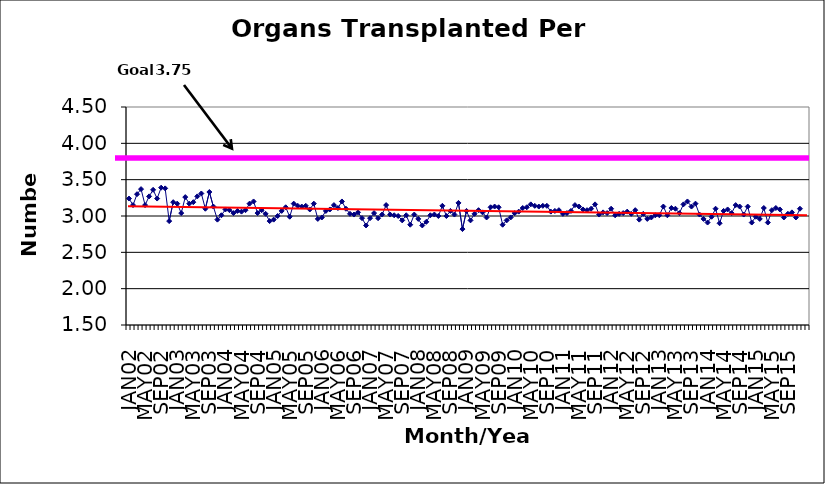
| Category | Series 0 |
|---|---|
| JAN02 | 3.24 |
| FEB02 | 3.15 |
| MAR02 | 3.3 |
| APR02 | 3.37 |
| MAY02 | 3.15 |
| JUN02 | 3.27 |
| JUL02 | 3.36 |
| AUG02 | 3.24 |
| SEP02 | 3.39 |
| OCT02 | 3.38 |
| NOV02 | 2.93 |
| DEC02 | 3.19 |
| JAN03 | 3.17 |
| FEB03 | 3.04 |
| MAR03 | 3.26 |
| APR03 | 3.17 |
| MAY03 | 3.19 |
| JUN03 | 3.27 |
| JUL03 | 3.31 |
| AUG03 | 3.1 |
| SEP03 | 3.33 |
| OCT03 | 3.13 |
| NOV03 | 2.95 |
| DEC03 | 3.01 |
| JAN04 | 3.09 |
| FEB04 | 3.08 |
| MAR04 | 3.04 |
| APR04 | 3.07 |
| MAY04 | 3.06 |
| JUN04 | 3.08 |
| JUL04 | 3.17 |
| AUG04 | 3.2 |
| SEP04 | 3.04 |
| OCT04 | 3.08 |
| NOV04 | 3.03 |
| DEC04 | 2.93 |
| JAN05 | 2.95 |
| FEB05 | 3 |
| MAR05 | 3.07 |
| APR05 | 3.12 |
| MAY05 | 2.99 |
| JUN05 | 3.17 |
| JUL05 | 3.14 |
| AUG05 | 3.13 |
| SEP05 | 3.14 |
| OCT05 | 3.09 |
| NOV05 | 3.17 |
| DEC05 | 2.96 |
| JAN06 | 2.98 |
| FEB06 | 3.07 |
| MAR06 | 3.09 |
| APR06 | 3.15 |
| MAY06 | 3.11 |
| JUN06 | 3.2 |
| JUL06 | 3.1 |
| AUG06 | 3.03 |
| SEP06 | 3.02 |
| OCT06 | 3.05 |
| NOV06 | 2.97 |
| DEC06 | 2.87 |
| JAN07 | 2.97 |
| FEB07 | 3.04 |
| MAR07 | 2.97 |
| APR07 | 3.02 |
| MAY07 | 3.15 |
| JUN07 | 3.02 |
| JUL07 | 3.01 |
| AUG07 | 3 |
| SEP07 | 2.94 |
| OCT07 | 3.01 |
| NOV07 | 2.88 |
| DEC07 | 3.02 |
| JAN08 | 2.96 |
| FEB08 | 2.87 |
| MAR08 | 2.92 |
| APR08 | 3.01 |
| MAY08 | 3.02 |
| JUN08 | 3 |
| JUL08 | 3.14 |
| AUG08 | 3 |
| SEP08 | 3.07 |
| OCT08 | 3.02 |
| NOV08 | 3.18 |
| DEC08 | 2.82 |
| JAN09 | 3.07 |
| FEB09 | 2.94 |
| MAR09 | 3.03 |
| APR09 | 3.08 |
| MAY09 | 3.05 |
| JUN09 | 2.98 |
| JUL09 | 3.12 |
| AUG09 | 3.13 |
| SEP09 | 3.12 |
| OCT09 | 2.88 |
| NOV09 | 2.94 |
| DEC09 | 2.98 |
| JAN10 | 3.04 |
| FEB10 | 3.06 |
| MAR10 | 3.11 |
| APR10 | 3.12 |
| MAY10 | 3.16 |
| JUN10 | 3.14 |
| JUL10 | 3.13 |
| AUG10 | 3.14 |
| SEP10 | 3.14 |
| OCT10 | 3.06 |
| NOV10 | 3.07 |
| DEC10 | 3.08 |
| JAN11 | 3.03 |
| FEB11 | 3.04 |
| MAR11 | 3.07 |
| APR11 | 3.15 |
| MAY11 | 3.13 |
| JUN11 | 3.09 |
| JUL11 | 3.08 |
| AUG11 | 3.1 |
| SEP11 | 3.16 |
| OCT11 | 3.02 |
| NOV11 | 3.05 |
| DEC11 | 3.04 |
| JAN12 | 3.1 |
| FEB12 | 3.01 |
| MAR12 | 3.03 |
| APR12 | 3.04 |
| MAY12 | 3.06 |
| JUN12 | 3.03 |
| JUL12 | 3.08 |
| AUG12 | 2.95 |
| SEP12 | 3.03 |
| OCT12 | 2.96 |
| NOV12 | 2.98 |
| DEC12 | 3.01 |
| JAN13 | 3.01 |
| FEB13 | 3.13 |
| MAR13 | 3.01 |
| APR13 | 3.11 |
| MAY13 | 3.1 |
| JUN13 | 3.04 |
| JUL13 | 3.16 |
| AUG13 | 3.2 |
| SEP13 | 3.13 |
| OCT13 | 3.17 |
| NOV13 | 3.02 |
| DEC13 | 2.96 |
| JAN14 | 2.91 |
| FEB14 | 2.99 |
| MAR14 | 3.1 |
| APR14 | 2.9 |
| MAY14 | 3.07 |
| JUN14 | 3.09 |
| JUL14 | 3.04 |
| AUG14 | 3.15 |
| SEP14 | 3.13 |
| OCT14 | 3.02 |
| NOV14 | 3.13 |
| DEC14 | 2.91 |
| JAN15 | 2.99 |
| FEB15 | 2.96 |
| MAR15 | 3.11 |
| APR15 | 2.91 |
| MAY15 | 3.08 |
| JUN15 | 3.11 |
| JUL15 | 3.09 |
| AUG15 | 2.98 |
| SEP15 | 3.03 |
| OCT15 | 3.05 |
| NOV15 | 2.98 |
| DEC15 | 3.1 |